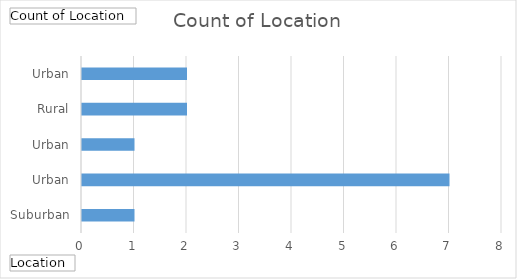
| Category | Total |
|---|---|
| Suburban | 1 |
| Urban | 7 |
| Urban, Rural | 1 |
| Urban, Suburban | 2 |
| Urban, Suburban, Rural | 2 |